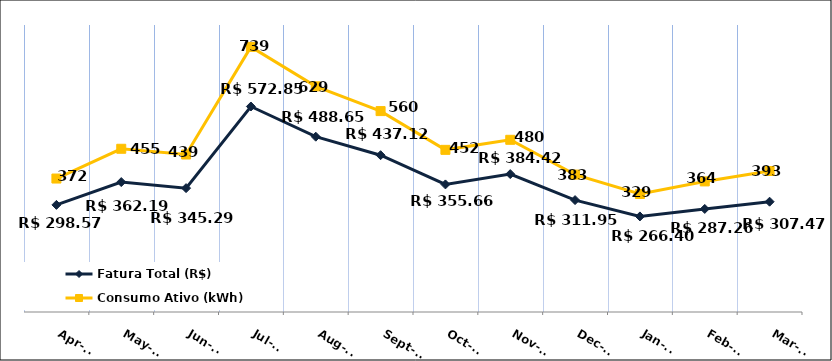
| Category | Fatura Total (R$) |
|---|---|
| 2023-04-01 | 298.57 |
| 2023-05-01 | 362.19 |
| 2023-06-01 | 345.29 |
| 2023-07-01 | 572.85 |
| 2023-08-01 | 488.65 |
| 2023-09-01 | 437.12 |
| 2023-10-01 | 355.66 |
| 2023-11-01 | 384.42 |
| 2023-12-01 | 311.95 |
| 2024-01-01 | 266.4 |
| 2024-02-01 | 287.26 |
| 2024-03-01 | 307.47 |